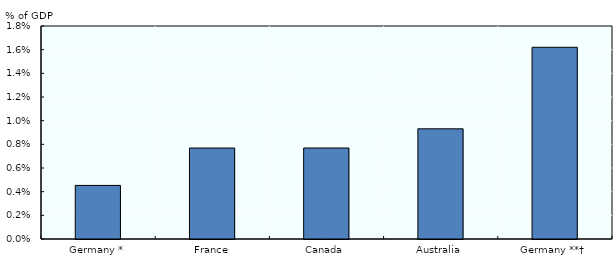
| Category | Series 0 |
|---|---|
| Germany * | 0.005 |
| France | 0.008 |
| Canada | 0.008 |
| Australia | 0.009 |
| Germany **† | 0.016 |